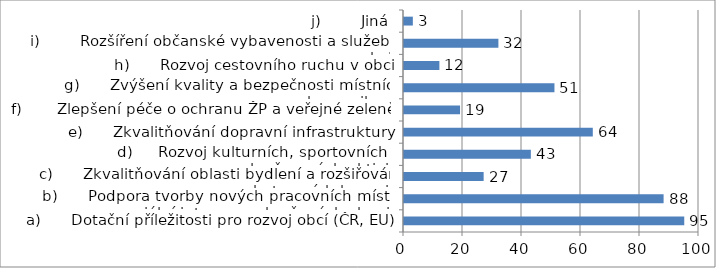
| Category | Series 0 |
|---|---|
| a)      Dotační příležitosti pro rozvoj obcí (ČR, EU) | 95 |
| b)      Podpora tvorby nových pracovních míst a sociální integrace ohrožených skupin | 88 |
| c)      Zkvalitňování oblasti bydlení a rozšiřování ubytovacích kapacit | 27 |
| d)     Rozvoj kulturních, sportovních a volnočasových aktivit | 43 |
| e)      Zkvalitňování dopravní infrastruktury | 64 |
| f)       Zlepšení péče o ochranu ŽP a veřejné zeleně | 19 |
| g)      Zvýšení kvality a bezpečnosti místních komunikací | 51 |
| h)      Rozvoj cestovního ruchu v obci | 12 |
| i)        Rozšíření občanské vybavenosti a služeb v obci | 32 |
| j)        Jiná | 3 |